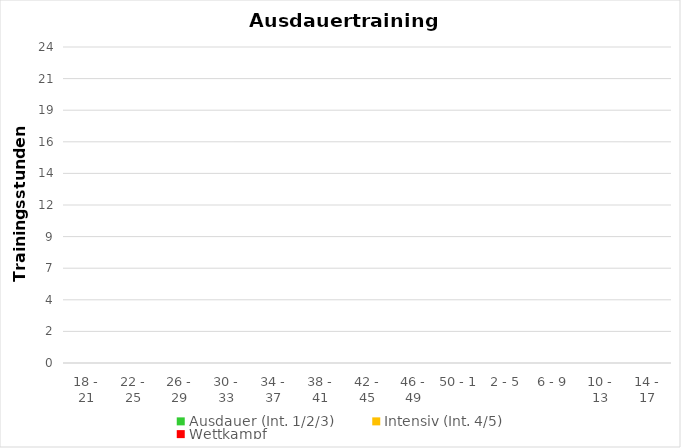
| Category | Ausdauer (Int. 1/2/3) | Intensiv (Int. 4/5) | Wettkampf |
|---|---|---|---|
| 18 - 21 | 0 | 0 | 0 |
| 22 - 25 | 0 | 0 | 0 |
| 26 - 29 | 0 | 0 | 0 |
| 30 - 33 | 0 | 0 | 0 |
| 34 - 37 | 0 | 0 | 0 |
| 38 - 41 | 0 | 0 | 0 |
| 42 - 45 | 0 | 0 | 0 |
| 46 - 49 | 0 | 0 | 0 |
| 50 - 1 | 0 | 0 | 0 |
| 2 - 5 | 0 | 0 | 0 |
| 6 - 9 | 0 | 0 | 0 |
| 10 - 13 | 0 | 0 | 0 |
| 14 - 17 | 0 | 0 | 0 |